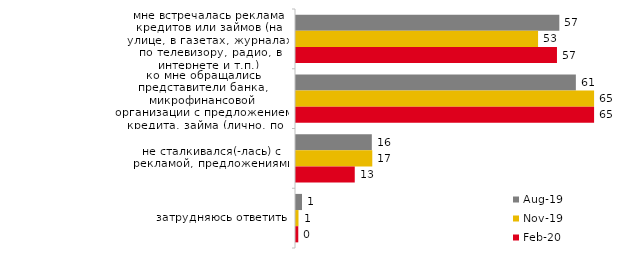
| Category | авг.19 | ноя.19 | фев.20 |
|---|---|---|---|
| мне встречалась реклама кредитов или займов (на улице, в газетах, журналах, по телевизору, радио, в интернете и т.п.) | 57.243 | 52.624 | 56.733 |
| ко мне обращались представители банка, микрофинансовой организации с предложением кредита, займа (лично, по телефону, через СМС, в офисе банка и т.п.) | 60.839 | 64.802 | 64.802 |
| не сталкивался(-лась) с рекламой, предложениями | 16.484 | 16.584 | 12.772 |
| затрудняюсь ответить | 1.299 | 0.545 | 0.495 |